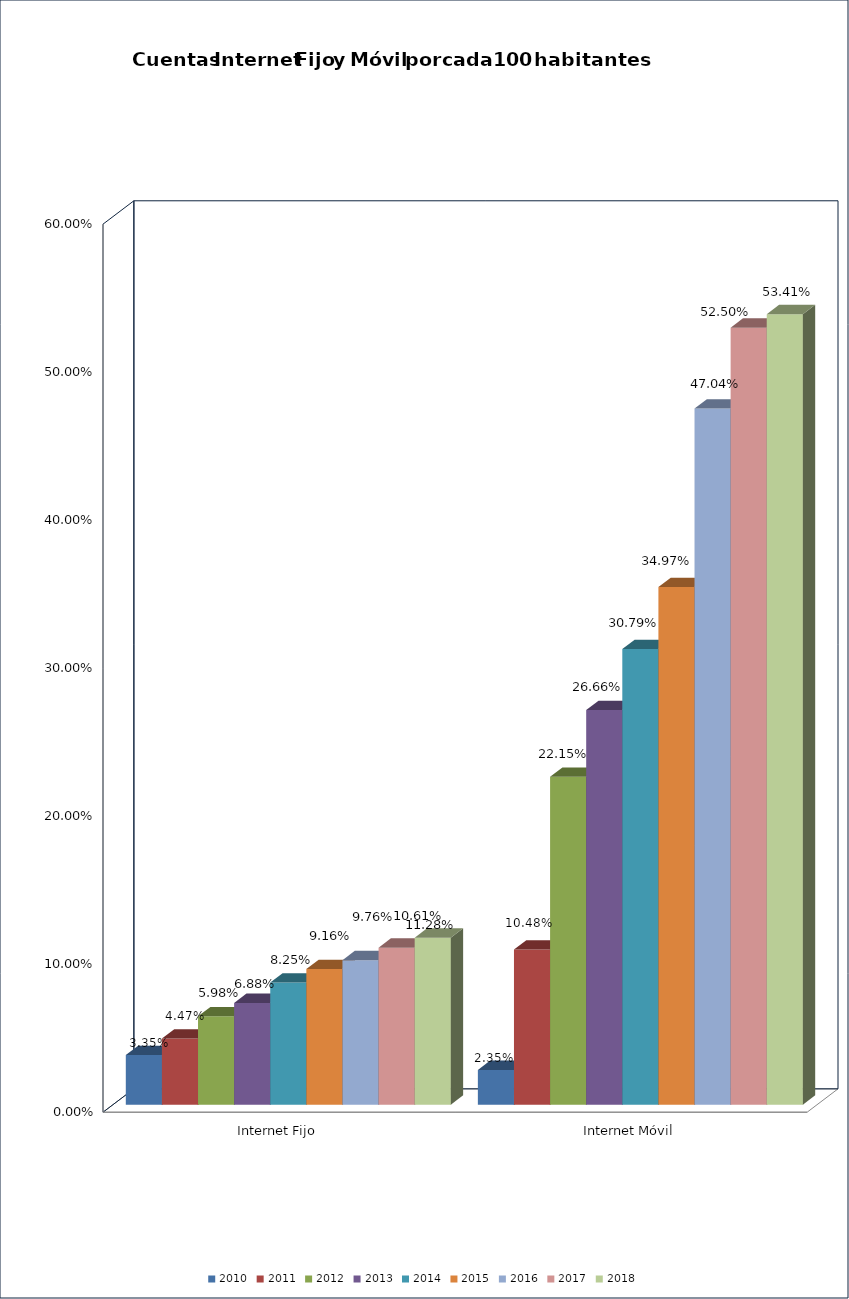
| Category | 2010 | 2011 | 2012 | 2013 | 2014 | 2015 | 2016 | 2017 | 2018 |
|---|---|---|---|---|---|---|---|---|---|
| Internet Fijo | 0.033 | 0.045 | 0.06 | 0.069 | 0.083 | 0.092 | 0.098 | 0.106 | 0.113 |
| Internet Móvil | 0.024 | 0.105 | 0.222 | 0.267 | 0.308 | 0.35 | 0.47 | 0.525 | 0.534 |